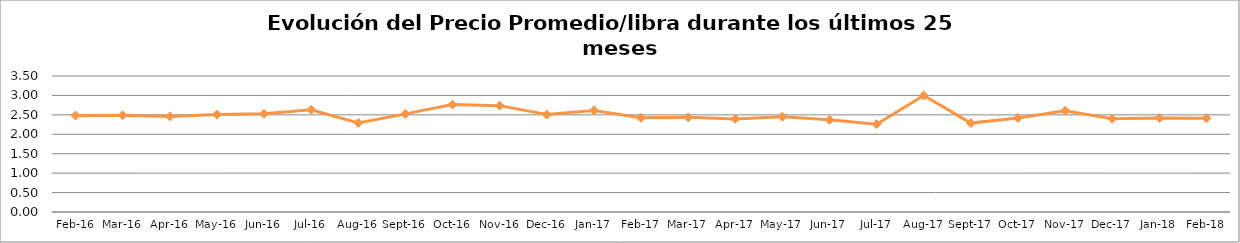
| Category | Series 0 |
|---|---|
| 2016-02-01 | 2.484 |
| 2016-03-01 | 2.488 |
| 2016-04-01 | 2.46 |
| 2016-05-01 | 2.506 |
| 2016-06-01 | 2.527 |
| 2016-07-01 | 2.631 |
| 2016-08-01 | 2.292 |
| 2016-09-01 | 2.525 |
| 2016-10-01 | 2.764 |
| 2016-11-01 | 2.737 |
| 2016-12-01 | 2.508 |
| 2017-01-01 | 2.615 |
| 2017-02-01 | 2.424 |
| 2017-03-01 | 2.436 |
| 2017-04-01 | 2.396 |
| 2017-05-01 | 2.452 |
| 2017-06-01 | 2.372 |
| 2017-07-01 | 2.26 |
| 2017-08-01 | 2.997 |
| 2017-09-01 | 2.288 |
| 2017-10-01 | 2.421 |
| 2017-11-01 | 2.605 |
| 2017-12-01 | 2.4 |
| 2018-01-01 | 2.42 |
| 2018-02-01 | 2.412 |